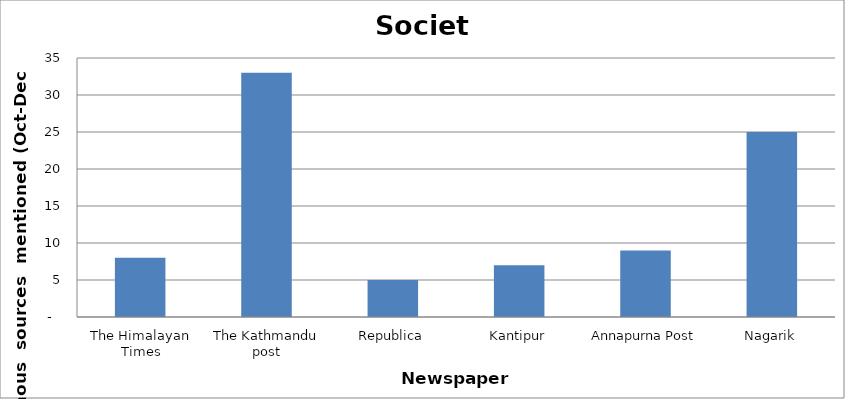
| Category | Society |
|---|---|
| The Himalayan Times | 8 |
| The Kathmandu post | 33 |
| Republica | 5 |
| Kantipur | 7 |
| Annapurna Post | 9 |
| Nagarik | 25 |